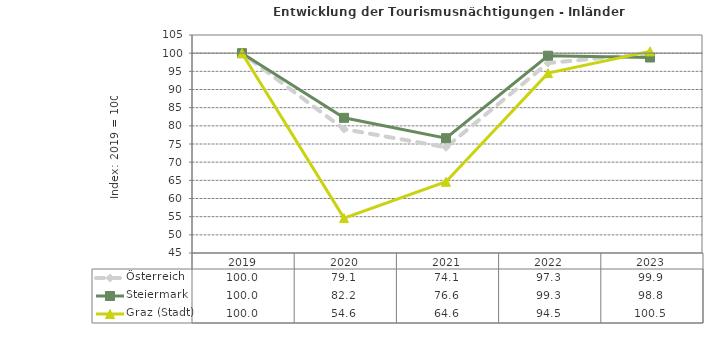
| Category | Österreich | Steiermark | Graz (Stadt) |
|---|---|---|---|
| 2023.0 | 99.9 | 98.8 | 100.5 |
| 2022.0 | 97.3 | 99.3 | 94.5 |
| 2021.0 | 74.1 | 76.6 | 64.6 |
| 2020.0 | 79.1 | 82.2 | 54.6 |
| 2019.0 | 100 | 100 | 100 |